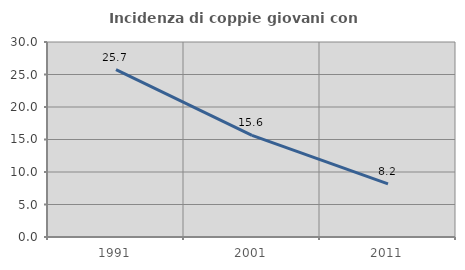
| Category | Incidenza di coppie giovani con figli |
|---|---|
| 1991.0 | 25.745 |
| 2001.0 | 15.625 |
| 2011.0 | 8.179 |